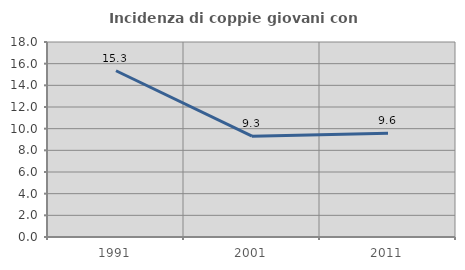
| Category | Incidenza di coppie giovani con figli |
|---|---|
| 1991.0 | 15.346 |
| 2001.0 | 9.302 |
| 2011.0 | 9.588 |